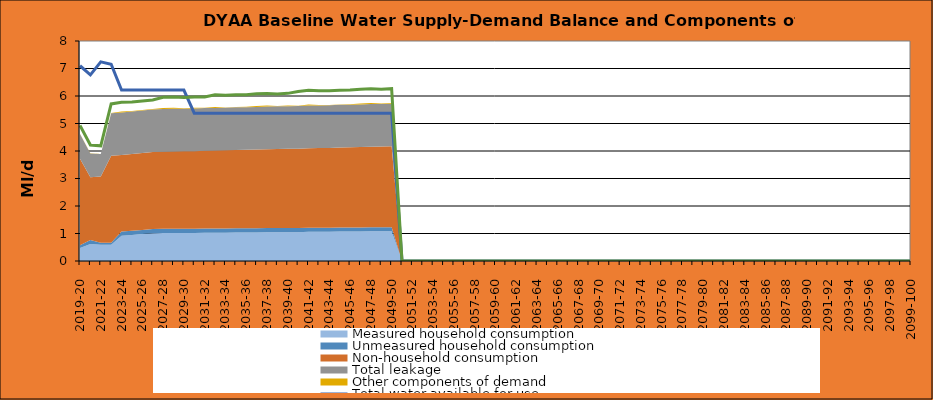
| Category | Total water available for use | Total demand + target headroom (baseline) |
|---|---|---|
| 0 | 7.1 | 4.93 |
| 1 | 6.77 | 4.22 |
| 2 | 7.24 | 4.188 |
| 3 | 7.154 | 5.712 |
| 4 | 6.214 | 5.77 |
| 5 | 6.214 | 5.781 |
| 6 | 6.214 | 5.817 |
| 7 | 6.214 | 5.853 |
| 8 | 6.214 | 5.954 |
| 9 | 6.214 | 5.96 |
| 10 | 6.214 | 5.941 |
| 11 | 5.374 | 5.962 |
| 12 | 5.374 | 5.963 |
| 13 | 5.374 | 6.044 |
| 14 | 5.374 | 6.025 |
| 15 | 5.374 | 6.041 |
| 16 | 5.374 | 6.047 |
| 17 | 5.374 | 6.078 |
| 18 | 5.374 | 6.094 |
| 19 | 5.374 | 6.075 |
| 20 | 5.374 | 6.096 |
| 21 | 5.374 | 6.167 |
| 22 | 5.374 | 6.208 |
| 23 | 5.374 | 6.189 |
| 24 | 5.374 | 6.195 |
| 25 | 5.374 | 6.211 |
| 26 | 5.374 | 6.217 |
| 27 | 5.374 | 6.248 |
| 28 | 5.374 | 6.264 |
| 29 | 5.374 | 6.245 |
| 30 | 5.374 | 6.266 |
| 31 | 0 | 0 |
| 32 | 0 | 0 |
| 33 | 0 | 0 |
| 34 | 0 | 0 |
| 35 | 0 | 0 |
| 36 | 0 | 0 |
| 37 | 0 | 0 |
| 38 | 0 | 0 |
| 39 | 0 | 0 |
| 40 | 0 | 0 |
| 41 | 0 | 0 |
| 42 | 0 | 0 |
| 43 | 0 | 0 |
| 44 | 0 | 0 |
| 45 | 0 | 0 |
| 46 | 0 | 0 |
| 47 | 0 | 0 |
| 48 | 0 | 0 |
| 49 | 0 | 0 |
| 50 | 0 | 0 |
| 51 | 0 | 0 |
| 52 | 0 | 0 |
| 53 | 0 | 0 |
| 54 | 0 | 0 |
| 55 | 0 | 0 |
| 56 | 0 | 0 |
| 57 | 0 | 0 |
| 58 | 0 | 0 |
| 59 | 0 | 0 |
| 60 | 0 | 0 |
| 61 | 0 | 0 |
| 62 | 0 | 0 |
| 63 | 0 | 0 |
| 64 | 0 | 0 |
| 65 | 0 | 0 |
| 66 | 0 | 0 |
| 67 | 0 | 0 |
| 68 | 0 | 0 |
| 69 | 0 | 0 |
| 70 | 0 | 0 |
| 71 | 0 | 0 |
| 72 | 0 | 0 |
| 73 | 0 | 0 |
| 74 | 0 | 0 |
| 75 | 0 | 0 |
| 76 | 0 | 0 |
| 77 | 0 | 0 |
| 78 | 0 | 0 |
| 79 | 0 | 0 |
| 80 | 0 | 0 |